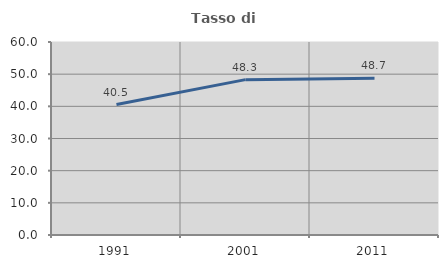
| Category | Tasso di occupazione   |
|---|---|
| 1991.0 | 40.547 |
| 2001.0 | 48.297 |
| 2011.0 | 48.708 |